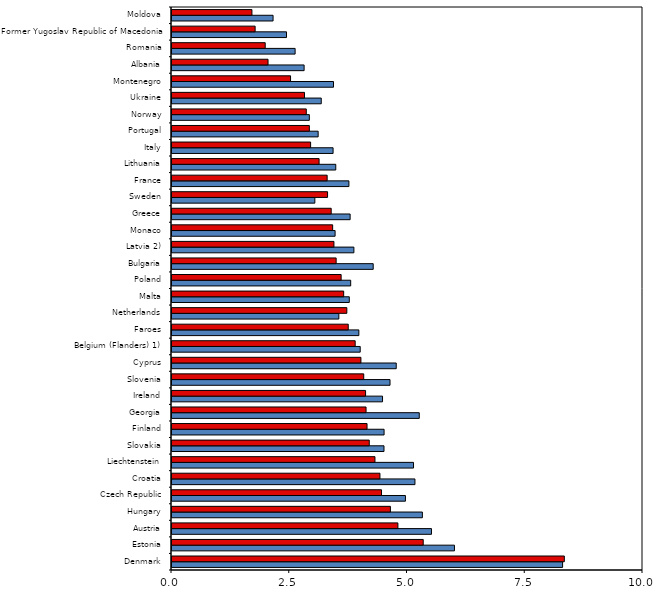
| Category | Boys | Girls |
|---|---|---|
| Denmark | 8.293 | 8.33 |
| Estonia | 5.997 | 5.334 |
| Austria | 5.509 | 4.796 |
| Hungary | 5.316 | 4.637 |
| Czech Republic | 4.956 | 4.448 |
| Croatia | 5.158 | 4.415 |
| Liechtenstein | 5.128 | 4.309 |
| Slovakia | 4.501 | 4.188 |
| Finland | 4.503 | 4.141 |
| Georgia | 5.25 | 4.12 |
| Ireland | 4.47 | 4.11 |
| Slovenia | 4.629 | 4.071 |
| Cyprus | 4.761 | 4.011 |
| Belgium (Flanders) 1) | 3.996 | 3.889 |
| Faroes | 3.967 | 3.742 |
| Netherlands | 3.542 | 3.712 |
| Malta | 3.764 | 3.645 |
| Poland | 3.794 | 3.591 |
| Bulgaria | 4.272 | 3.485 |
| Latvia 2) | 3.862 | 3.438 |
| Monaco | 3.463 | 3.411 |
| Greece | 3.782 | 3.38 |
| Sweden | 3.033 | 3.303 |
| France | 3.756 | 3.294 |
| Lithuania | 3.477 | 3.123 |
| Italy | 3.42 | 2.943 |
| Portugal | 3.103 | 2.916 |
| Norway | 2.916 | 2.851 |
| Ukraine | 3.169 | 2.813 |
| Montenegro | 3.429 | 2.517 |
| Albania | 2.805 | 2.039 |
| Romania | 2.614 | 1.979 |
| Former Yugoslav Republic of Macedonia | 2.431 | 1.765 |
| Moldova | 2.146 | 1.697 |